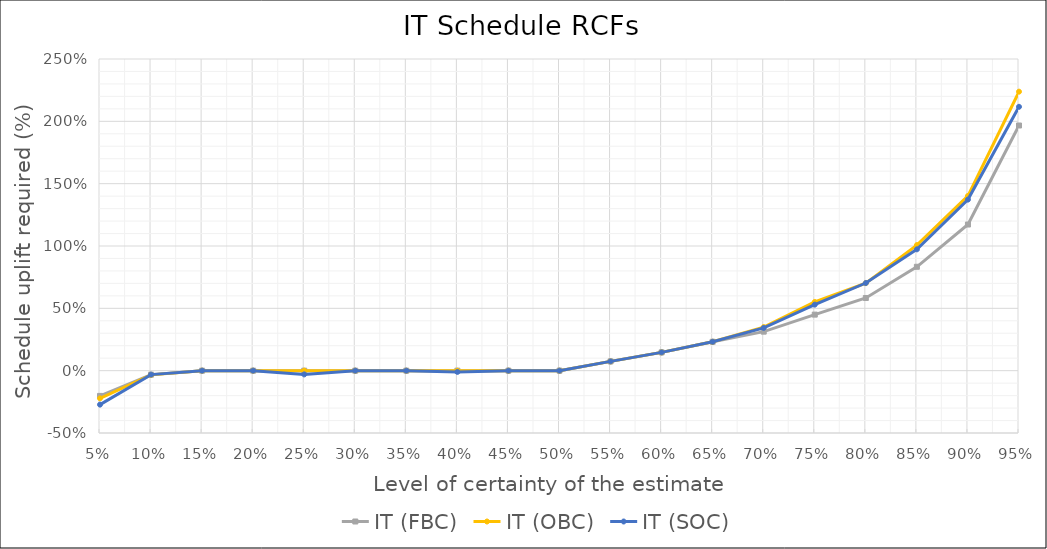
| Category | IT (FBC) | IT (OBC) | IT (SOC) |
|---|---|---|---|
| 0.05 | -0.202 | -0.222 | -0.272 |
| 0.1 | -0.032 | -0.034 | -0.032 |
| 0.15 | 0 | 0 | 0 |
| 0.2 | 0 | 0 | 0 |
| 0.25 | 0 | 0 | -0.03 |
| 0.3 | 0 | 0 | 0 |
| 0.35 | 0 | 0 | 0 |
| 0.4 | 0 | 0 | -0.01 |
| 0.45 | 0 | 0 | 0 |
| 0.5 | 0 | 0 | 0 |
| 0.55 | 0.074 | 0.074 | 0.074 |
| 0.6 | 0.147 | 0.147 | 0.147 |
| 0.65 | 0.232 | 0.232 | 0.232 |
| 0.7 | 0.313 | 0.349 | 0.343 |
| 0.75 | 0.45 | 0.551 | 0.53 |
| 0.8 | 0.583 | 0.702 | 0.703 |
| 0.85 | 0.833 | 1.007 | 0.973 |
| 0.9 | 1.172 | 1.401 | 1.372 |
| 0.95 | 1.966 | 2.238 | 2.116 |